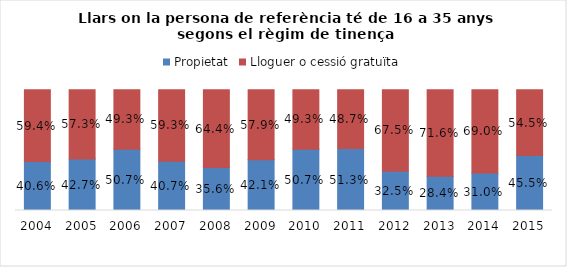
| Category | Propietat | Lloguer o cessió gratuïta |
|---|---|---|
| 2004.0 | 0.406 | 0.594 |
| 2005.0 | 0.427 | 0.573 |
| 2006.0 | 0.507 | 0.493 |
| 2007.0 | 0.407 | 0.593 |
| 2008.0 | 0.356 | 0.644 |
| 2009.0 | 0.421 | 0.579 |
| 2010.0 | 0.507 | 0.493 |
| 2011.0 | 0.513 | 0.487 |
| 2012.0 | 0.325 | 0.675 |
| 2013.0 | 0.284 | 0.716 |
| 2014.0 | 0.31 | 0.69 |
| 2015.0 | 0.455 | 0.545 |